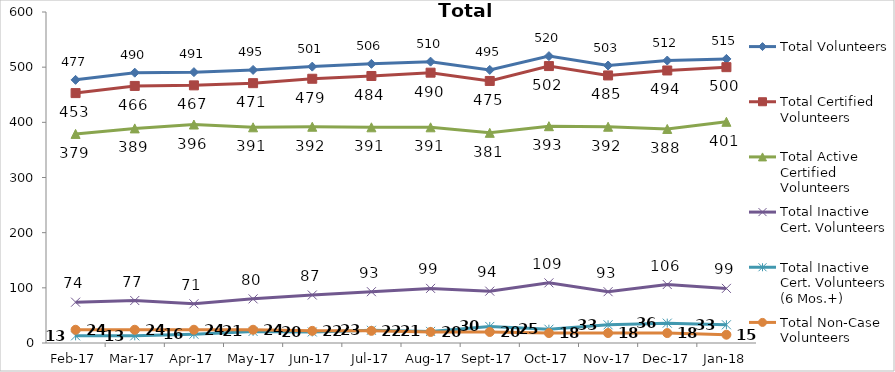
| Category | Total Volunteers | Total Certified Volunteers | Total Active Certified Volunteers | Total Inactive Cert. Volunteers | Total Inactive Cert. Volunteers (6 Mos.+) | Total Non-Case Volunteers |
|---|---|---|---|---|---|---|
| 2017-02-01 | 477 | 453 | 379 | 74 | 13 | 24 |
| 2017-03-01 | 490 | 466 | 389 | 77 | 13 | 24 |
| 2017-04-01 | 491 | 467 | 396 | 71 | 16 | 24 |
| 2017-05-01 | 495 | 471 | 391 | 80 | 21 | 24 |
| 2017-06-01 | 501 | 479 | 392 | 87 | 20 | 22 |
| 2017-07-01 | 506 | 484 | 391 | 93 | 23 | 22 |
| 2017-08-01 | 510 | 490 | 391 | 99 | 21 | 20 |
| 2017-09-01 | 495 | 475 | 381 | 94 | 30 | 20 |
| 2017-10-01 | 520 | 502 | 393 | 109 | 25 | 18 |
| 2017-11-01 | 503 | 485 | 392 | 93 | 33 | 18 |
| 2017-12-01 | 512 | 494 | 388 | 106 | 36 | 18 |
| 2018-01-01 | 515 | 500 | 401 | 99 | 33 | 15 |